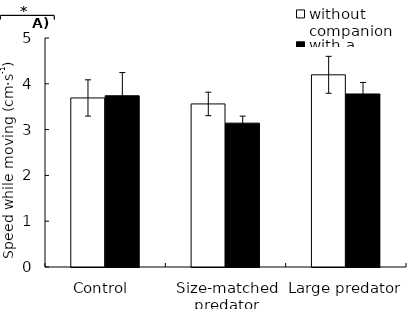
| Category | without companion | with a companion |
|---|---|---|
| Control  | 3.691 | 3.739 |
| Size-matched predator | 3.561 | 3.141 |
| Large predator | 4.197 | 3.778 |